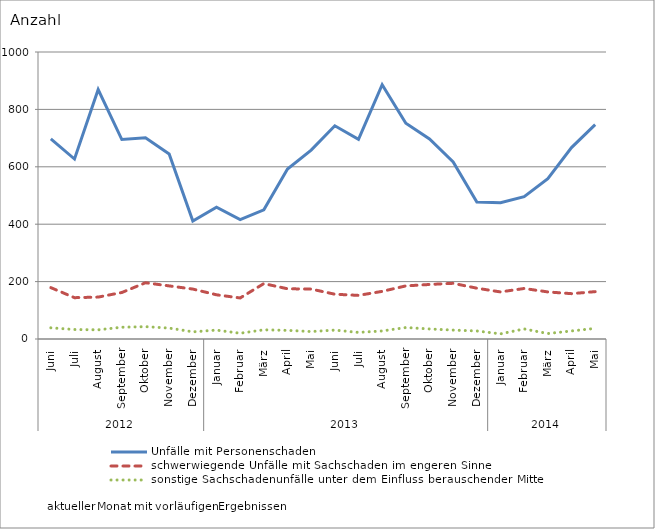
| Category | Unfälle mit Personenschaden | schwerwiegende Unfälle mit Sachschaden im engeren Sinne | sonstige Sachschadenunfälle unter dem Einfluss berauschender Mittel |
|---|---|---|---|
| 0 | 697 | 179 | 39 |
| 1 | 627 | 144 | 33 |
| 2 | 869 | 146 | 32 |
| 3 | 695 | 162 | 41 |
| 4 | 701 | 196 | 43 |
| 5 | 645 | 185 | 38 |
| 6 | 411 | 174 | 25 |
| 7 | 459 | 154 | 31 |
| 8 | 416 | 143 | 20 |
| 9 | 450 | 193 | 32 |
| 10 | 592 | 175 | 30 |
| 11 | 658 | 174 | 26 |
| 12 | 743 | 156 | 31 |
| 13 | 696 | 152 | 23 |
| 14 | 886 | 166 | 28 |
| 15 | 752 | 185 | 40 |
| 16 | 697 | 190 | 35 |
| 17 | 617 | 194 | 31 |
| 18 | 477 | 177 | 28 |
| 19 | 475 | 164 | 18 |
| 20 | 496 | 176 | 35 |
| 21 | 559 | 164 | 19 |
| 22 | 667 | 158 | 28 |
| 23 | 747 | 165 | 37 |